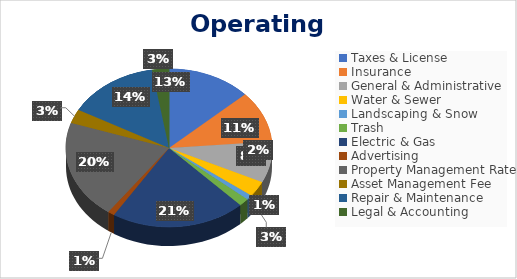
| Category | Series 0 |
|---|---|
| Taxes & License  | 25000 |
| Insurance | 20000 |
| General & Administrative | 16000 |
| Water & Sewer | 6000 |
| Landscaping & Snow | 1887 |
| Trash | 3000 |
| Electric & Gas | 40000 |
| Advertising | 2000 |
| Property Management Rate | 38201.31 |
| Asset Management Fee | 5457.33 |
| Repair & Maintenance | 27286.65 |
| Legal & Accounting | 5000 |